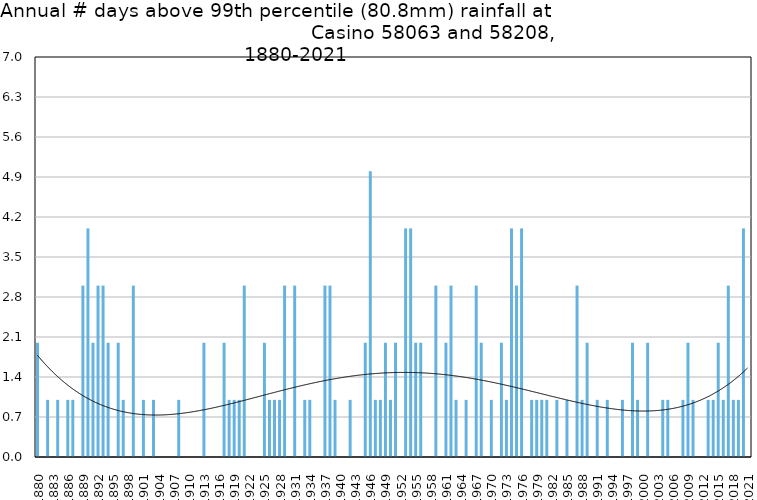
| Category | Annual # days above 99th percentile |
|---|---|
| 1880 | 2 |
| 1881 | 0 |
| 1882 | 1 |
| 1883 | 0 |
| 1884 | 1 |
| 1885 | 0 |
| 1886 | 1 |
| 1887 | 1 |
| 1888 | 0 |
| 1889 | 3 |
| 1890 | 4 |
| 1891 | 2 |
| 1892 | 3 |
| 1893 | 3 |
| 1894 | 2 |
| 1895 | 0 |
| 1896 | 2 |
| 1897 | 1 |
| 1898 | 0 |
| 1899 | 3 |
| 1900 | 0 |
| 1901 | 1 |
| 1902 | 0 |
| 1903 | 1 |
| 1904 | 0 |
| 1905 | 0 |
| 1906 | 0 |
| 1907 | 0 |
| 1908 | 1 |
| 1909 | 0 |
| 1910 | 0 |
| 1911 | 0 |
| 1912 | 0 |
| 1913 | 2 |
| 1914 | 0 |
| 1915 | 0 |
| 1916 | 0 |
| 1917 | 2 |
| 1918 | 1 |
| 1919 | 1 |
| 1920 | 1 |
| 1921 | 3 |
| 1922 | 0 |
| 1923 | 0 |
| 1924 | 0 |
| 1925 | 2 |
| 1926 | 1 |
| 1927 | 1 |
| 1928 | 1 |
| 1929 | 3 |
| 1930 | 0 |
| 1931 | 3 |
| 1932 | 0 |
| 1933 | 1 |
| 1934 | 1 |
| 1935 | 0 |
| 1936 | 0 |
| 1937 | 3 |
| 1938 | 3 |
| 1939 | 1 |
| 1940 | 0 |
| 1941 | 0 |
| 1942 | 1 |
| 1943 | 0 |
| 1944 | 0 |
| 1945 | 2 |
| 1946 | 5 |
| 1947 | 1 |
| 1948 | 1 |
| 1949 | 2 |
| 1950 | 1 |
| 1951 | 2 |
| 1952 | 0 |
| 1953 | 4 |
| 1954 | 4 |
| 1955 | 2 |
| 1956 | 2 |
| 1957 | 0 |
| 1958 | 0 |
| 1959 | 3 |
| 1960 | 0 |
| 1961 | 2 |
| 1962 | 3 |
| 1963 | 1 |
| 1964 | 0 |
| 1965 | 1 |
| 1966 | 0 |
| 1967 | 3 |
| 1968 | 2 |
| 1969 | 0 |
| 1970 | 1 |
| 1971 | 0 |
| 1972 | 2 |
| 1973 | 1 |
| 1974 | 4 |
| 1975 | 3 |
| 1976 | 4 |
| 1977 | 0 |
| 1978 | 1 |
| 1979 | 1 |
| 1980 | 1 |
| 1981 | 1 |
| 1982 | 0 |
| 1983 | 1 |
| 1984 | 0 |
| 1985 | 1 |
| 1986 | 0 |
| 1987 | 3 |
| 1988 | 1 |
| 1989 | 2 |
| 1990 | 0 |
| 1991 | 1 |
| 1992 | 0 |
| 1993 | 1 |
| 1994 | 0 |
| 1995 | 0 |
| 1996 | 1 |
| 1997 | 0 |
| 1998 | 2 |
| 1999 | 1 |
| 2000 | 0 |
| 2001 | 2 |
| 2002 | 0 |
| 2003 | 0 |
| 2004 | 1 |
| 2005 | 1 |
| 2006 | 0 |
| 2007 | 0 |
| 2008 | 1 |
| 2009 | 2 |
| 2010 | 1 |
| 2011 | 0 |
| 2012 | 0 |
| 2013 | 1 |
| 2014 | 1 |
| 2015 | 2 |
| 2016 | 1 |
| 2017 | 3 |
| 2018 | 1 |
| 2019 | 1 |
| 2020 | 4 |
| 2021 | 0 |